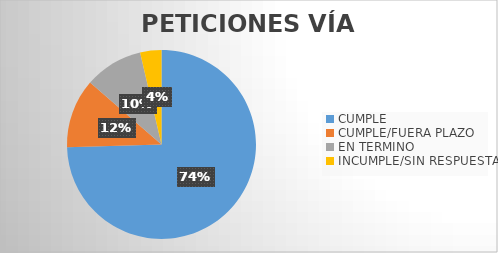
| Category | Series 0 |
|---|---|
| CUMPLE | 82 |
| CUMPLE/FUERA PLAZO | 13 |
| EN TERMINO | 11 |
| INCUMPLE/SIN RESPUESTA | 4 |